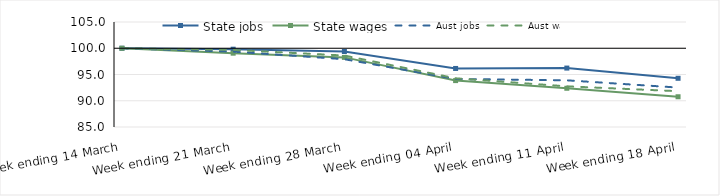
| Category | State jobs | State wages | Aust jobs | Aust wages |
|---|---|---|---|---|
| 2020-03-14 | 100 | 100 | 100 | 100 |
| 2020-03-21 | 99.819 | 99.061 | 99.358 | 99.683 |
| 2020-03-28 | 99.381 | 98.259 | 97.912 | 98.613 |
| 2020-04-04 | 96.152 | 93.838 | 94.152 | 94.278 |
| 2020-04-11 | 96.223 | 92.378 | 93.892 | 92.743 |
| 2020-04-18 | 94.279 | 90.761 | 92.512 | 91.82 |